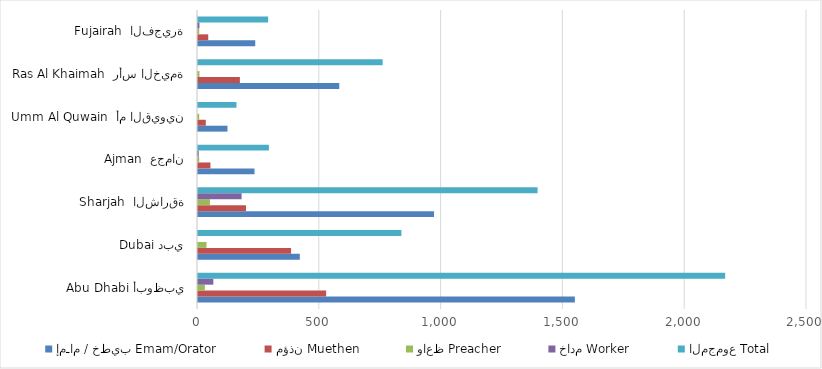
| Category | إمـام / خطيب | مؤذن | واعظ | خادم | المجموع |
|---|---|---|---|---|---|
| Abu Dhabi أبوظبي | 1547 | 526 | 28 | 63 | 2164 |
| Dubai دبي | 418 | 382 | 35 | 0 | 835 |
| Sharjah  الشارقة | 969 | 197 | 49 | 179 | 1394 |
| Ajman  عجمان | 232 | 51 | 5 | 3 | 291 |
| Umm Al Quwain  أم القيوين | 121 | 32 | 5 | 0 | 158 |
| Ras Al Khaimah  رأس الخيمة | 580 | 172 | 6 | 0 | 758 |
| Fujairah  الفجيرة | 235 | 42 | 5 | 6 | 288 |